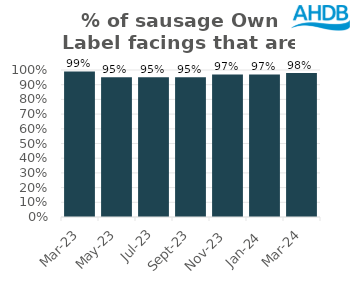
| Category | Sausage |
|---|---|
| 2023-03-01 | 0.99 |
| 2023-05-01 | 0.95 |
| 2023-07-01 | 0.95 |
| 2023-09-01 | 0.95 |
| 2023-11-01 | 0.97 |
| 2024-01-01 | 0.97 |
| 2024-03-01 | 0.98 |